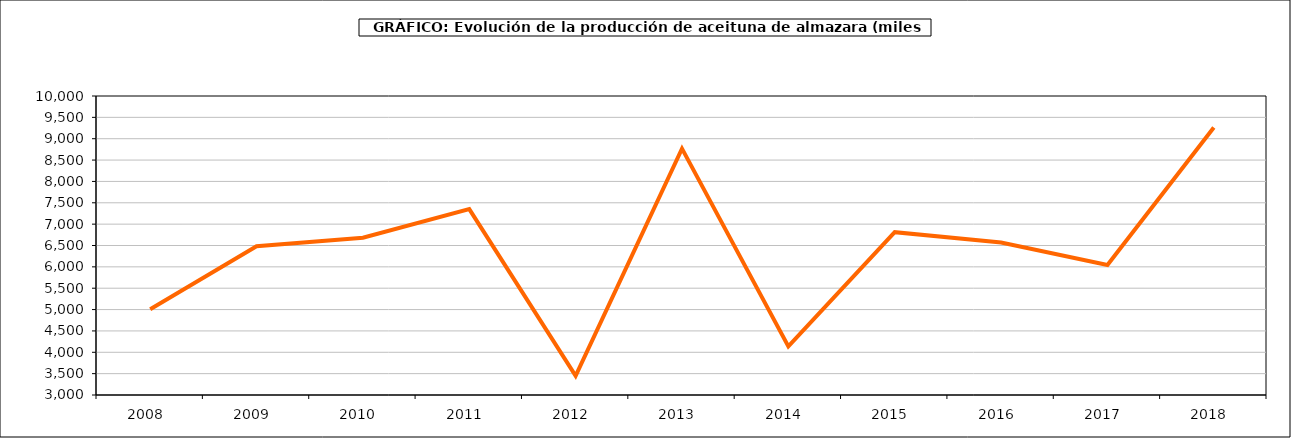
| Category | producción |
|---|---|
| 2008.0 | 5008.9 |
| 2009.0 | 6482.726 |
| 2010.0 | 6682.009 |
| 2011.0 | 7352.697 |
| 2012.0 | 3448.612 |
| 2013.0 | 8766.897 |
| 2014.0 | 4136.73 |
| 2015.0 | 6811.611 |
| 2016.0 | 6571.428 |
| 2017.0 | 6044.453 |
| 2018.0 | 9264.536 |